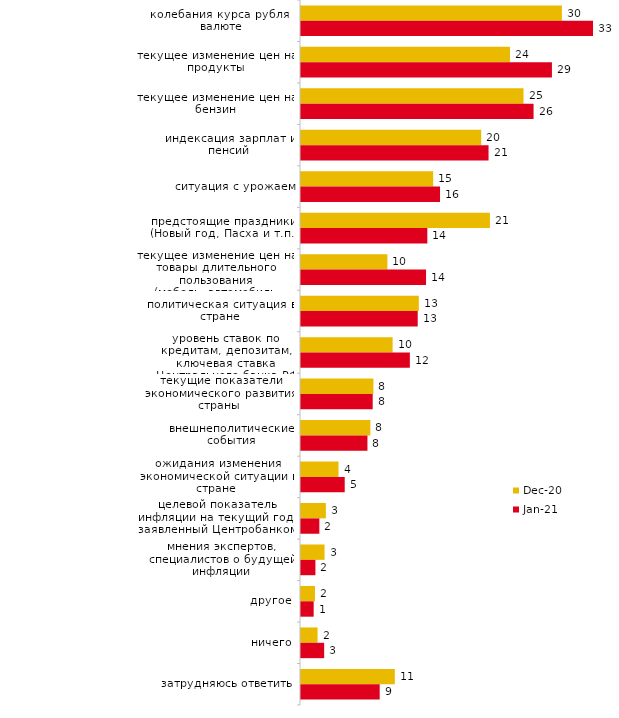
| Category | дек.20 | янв.21 |
|---|---|---|
| колебания курса рубля к валюте | 29.648 | 33.184 |
| текущее изменение цен на продукты | 23.748 | 28.515 |
| текущее изменение цен на бензин | 25.285 | 26.428 |
| индексация зарплат и пенсий | 20.476 | 21.311 |
| ситуация с урожаем | 15.022 | 15.797 |
| предстоящие праздники (Новый год, Пасха и т.п.) | 21.468 | 14.357 |
| текущее изменение цен на товары длительного пользования (мебель, автомобиль, бытовая техника и т.п.) | 9.817 | 14.208 |
| политическая ситуация в стране | 13.386 | 13.264 |
| уровень ставок по кредитам, депозитам, ключевая ставка Центрального банка РФ | 10.412 | 12.37 |
| текущие показатели экономического развития страны | 8.23 | 8.147 |
| внешнеполитические события | 7.883 | 7.551 |
| ожидания изменения экономической ситуации в стране | 4.264 | 4.968 |
| целевой показатель инфляции на текущий год, заявленный Центробанком | 2.826 | 2.086 |
| мнения экспертов, специалистов о будущей инфляции | 2.677 | 1.639 |
| другое | 1.587 | 1.441 |
| ничего | 1.884 | 2.633 |
| затрудняюсь ответить | 10.659 | 8.942 |